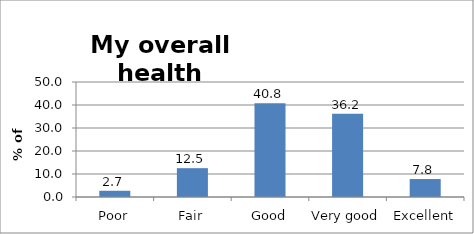
| Category | Series 0 |
|---|---|
| Poor | 2.713 |
| Fair | 12.535 |
| Good | 40.769 |
| Very good | 36.176 |
| Excellent | 7.807 |